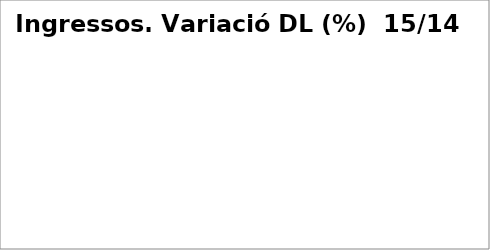
| Category | Series 0 |
|---|---|
| Impostos directes | 0.063 |
| Impostos indirectes | 0.012 |
| Taxes, preus públics i altres ingressos | -0.009 |
| Transferències corrents | 0.074 |
| Ingressos patrimonials | 0.359 |
| Venda d'inversions reals | -0.615 |
| Transferències de capital | 2.177 |
| Actius financers* | 0 |
| Passius financers | -0.074 |